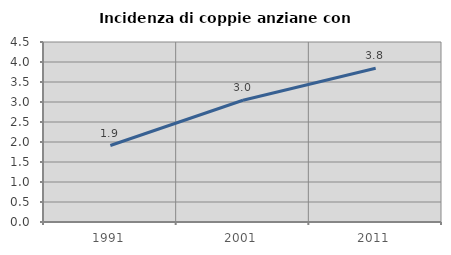
| Category | Incidenza di coppie anziane con figli |
|---|---|
| 1991.0 | 1.912 |
| 2001.0 | 3.043 |
| 2011.0 | 3.842 |